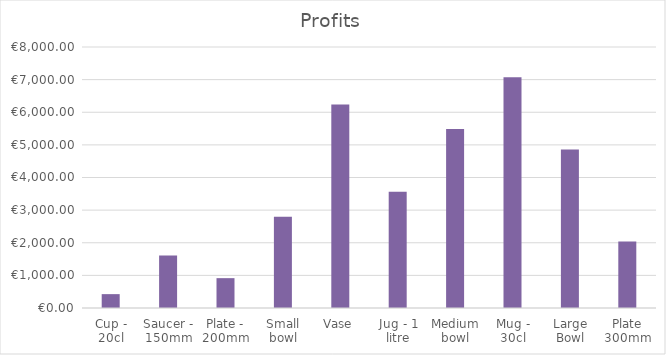
| Category | Series 0 |
|---|---|
| Cup - 20cl | 425 |
| Saucer - 150mm | 1606.5 |
| Plate - 200mm | 914.813 |
| Small bowl | 2795.65 |
| Vase | 6241.125 |
| Jug - 1 litre | 3563.625 |
| Medium bowl | 5488.875 |
| Mug - 30cl | 7076.25 |
| Large Bowl | 4857.75 |
| Plate 300mm | 2040 |